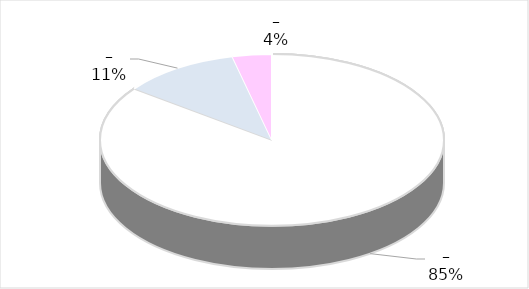
| Category | Series 0 |
|---|---|
| 0 | 23 |
| 1 | 3 |
| 2 | 1 |